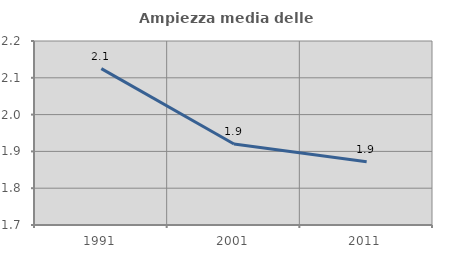
| Category | Ampiezza media delle famiglie |
|---|---|
| 1991.0 | 2.125 |
| 2001.0 | 1.92 |
| 2011.0 | 1.872 |